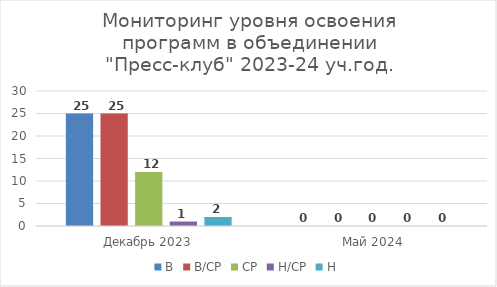
| Category | В | В/СР | СР | Н/СР | Н |
|---|---|---|---|---|---|
| Декабрь 2023 | 25 | 25 | 12 | 1 | 2 |
| Май 2024 | 0 | 0 | 0 | 0 | 0 |